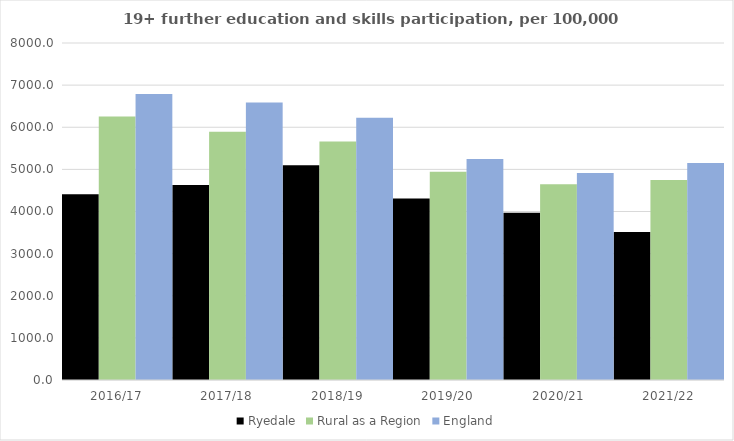
| Category | Ryedale | Rural as a Region | England |
|---|---|---|---|
| 2016/17 | 4411 | 6253.401 | 6788 |
| 2017/18 | 4631 | 5892.029 | 6588 |
| 2018/19 | 5100 | 5661.873 | 6227 |
| 2019/20 | 4308 | 4943.801 | 5244 |
| 2020/21 | 3968 | 4646.727 | 4913 |
| 2021/22 | 3515 | 4747.049 | 5151 |